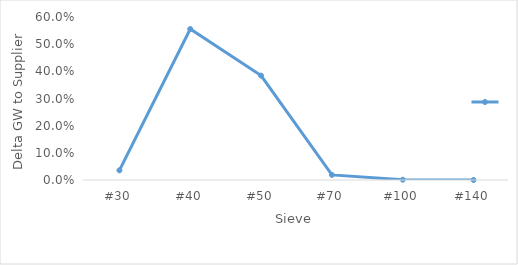
| Category | Series 0 |
|---|---|
| #30 | 0.035 |
| #40 | 0.556 |
| #50 | 0.384 |
| #70 | 0.019 |
| #100 | 0.001 |
| #140 | 0 |